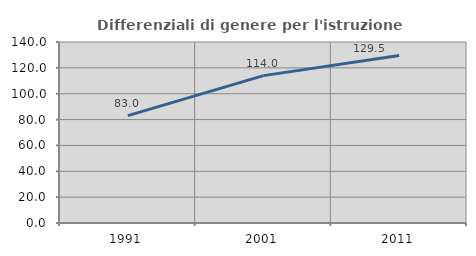
| Category | Differenziali di genere per l'istruzione superiore |
|---|---|
| 1991.0 | 83.035 |
| 2001.0 | 114.002 |
| 2011.0 | 129.538 |